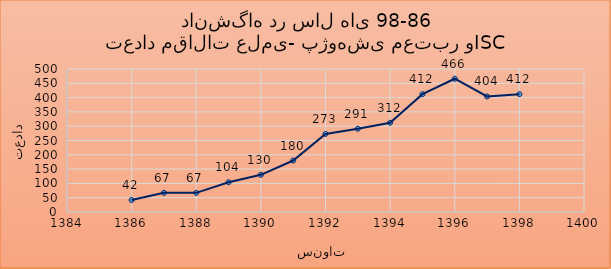
| Category | مجموع مقالات دانشگاه |
|---|---|
| 1386.0 | 42 |
| 1387.0 | 67 |
| 1388.0 | 67 |
| 1389.0 | 104 |
| 1390.0 | 130 |
| 1391.0 | 180 |
| 1392.0 | 273 |
| 1393.0 | 291 |
| 1394.0 | 312 |
| 1395.0 | 412 |
| 1396.0 | 466 |
| 1397.0 | 404 |
| 1398.0 | 412 |